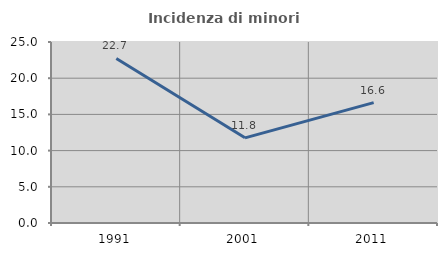
| Category | Incidenza di minori stranieri |
|---|---|
| 1991.0 | 22.727 |
| 2001.0 | 11.765 |
| 2011.0 | 16.626 |